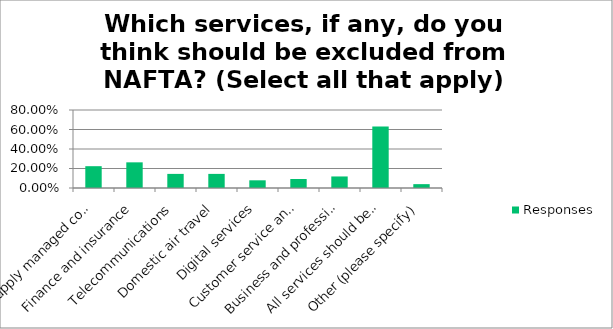
| Category | Responses |
|---|---|
| Supply managed commodities (dairy, poultry, eggs) | 0.224 |
| Finance and insurance | 0.263 |
| Telecommunications | 0.145 |
| Domestic air travel | 0.145 |
| Digital services | 0.079 |
| Customer service and support | 0.092 |
| Business and professional services (accounting, engineering, etc.) | 0.118 |
| All services should be included in NAFTA | 0.632 |
| Other (please specify) | 0.04 |